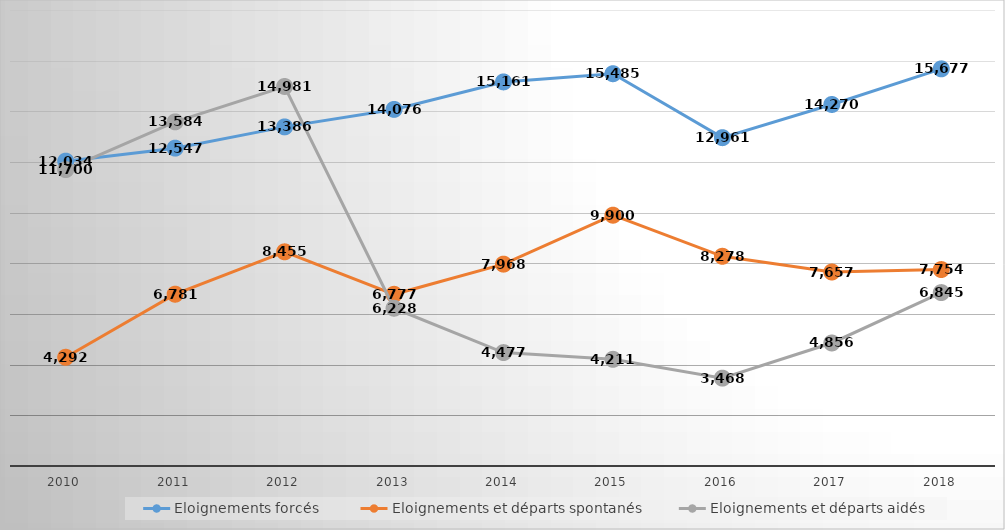
| Category | Eloignements forcés  | Eloignements et départs spontanés | Eloignements et départs aidés |
|---|---|---|---|
| 2010.0 | 12034 | 4292 | 11700 |
| 2011.0 | 12547 | 6781 | 13584 |
| 2012.0 | 13386 | 8455 | 14981 |
| 2013.0 | 14076 | 6777 | 6228 |
| 2014.0 | 15161 | 7968 | 4477 |
| 2015.0 | 15485 | 9900 | 4211 |
| 2016.0 | 12961 | 8278 | 3468 |
| 2017.0 | 14270 | 7657 | 4856 |
| 2018.0 | 15677 | 7754 | 6845 |